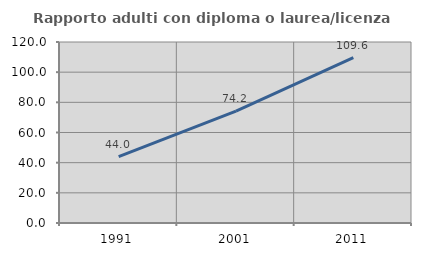
| Category | Rapporto adulti con diploma o laurea/licenza media  |
|---|---|
| 1991.0 | 44.022 |
| 2001.0 | 74.194 |
| 2011.0 | 109.592 |